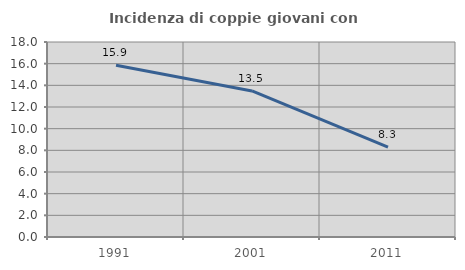
| Category | Incidenza di coppie giovani con figli |
|---|---|
| 1991.0 | 15.856 |
| 2001.0 | 13.483 |
| 2011.0 | 8.305 |